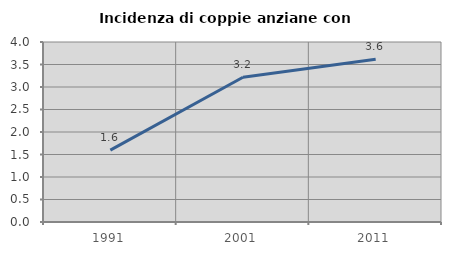
| Category | Incidenza di coppie anziane con figli |
|---|---|
| 1991.0 | 1.597 |
| 2001.0 | 3.218 |
| 2011.0 | 3.614 |